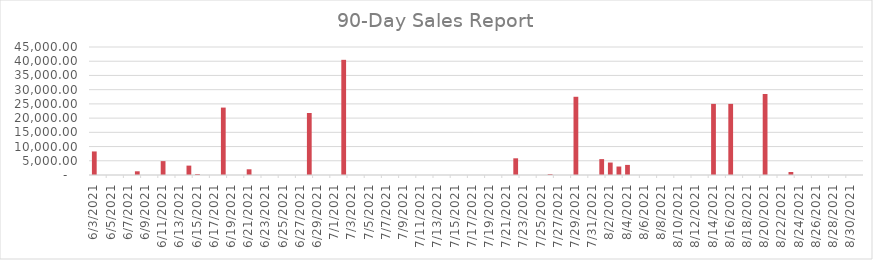
| Category | Sales |
|---|---|
| 8/31/21 | 0 |
| 8/30/21 | 0 |
| 8/29/21 | 0 |
| 8/28/21 | 0 |
| 8/27/21 | 0 |
| 8/26/21 | 0 |
| 8/25/21 | 0 |
| 8/24/21 | 0 |
| 8/23/21 | 1050 |
| 8/22/21 | 0 |
| 8/21/21 | 0 |
| 8/20/21 | 28480 |
| 8/19/21 | 0 |
| 8/18/21 | 0 |
| 8/17/21 | 0 |
| 8/16/21 | 25000 |
| 8/15/21 | 0 |
| 8/14/21 | 25000 |
| 8/13/21 | 0 |
| 8/12/21 | 0 |
| 8/11/21 | 0 |
| 8/10/21 | 0 |
| 8/9/21 | 0 |
| 8/8/21 | 0 |
| 8/7/21 | 0 |
| 8/6/21 | 0 |
| 8/5/21 | 0 |
| 8/4/21 | 3550 |
| 8/3/21 | 2980 |
| 8/2/21 | 4380 |
| 8/1/21 | 5580 |
| 7/31/21 | 0 |
| 7/30/21 | 0 |
| 7/29/21 | 27500 |
| 7/28/21 | 0 |
| 7/27/21 | 0 |
| 7/26/21 | 300 |
| 7/25/21 | 0 |
| 7/24/21 | 0 |
| 7/23/21 | 0 |
| 7/22/21 | 5870 |
| 7/21/21 | 0 |
| 7/20/21 | 0 |
| 7/19/21 | 0 |
| 7/18/21 | 0 |
| 7/17/21 | 0 |
| 7/16/21 | 0 |
| 7/15/21 | 0 |
| 7/14/21 | 0 |
| 7/13/21 | 0 |
| 7/12/21 | 0 |
| 7/11/21 | 0 |
| 7/10/21 | 0 |
| 7/9/21 | 0 |
| 7/8/21 | 0 |
| 7/7/21 | 0 |
| 7/6/21 | 0 |
| 7/5/21 | 0 |
| 7/4/21 | 0 |
| 7/3/21 | 0 |
| 7/2/21 | 40490 |
| 7/1/21 | 0 |
| 6/30/21 | 0 |
| 6/29/21 | 0 |
| 6/28/21 | 21800 |
| 6/27/21 | 0 |
| 6/26/21 | 0 |
| 6/25/21 | 0 |
| 6/24/21 | 0 |
| 6/23/21 | 0 |
| 6/22/21 | 0 |
| 6/21/21 | 2010 |
| 6/20/21 | 0 |
| 6/19/21 | 0 |
| 6/18/21 | 23700 |
| 6/17/21 | 0 |
| 6/16/21 | 0 |
| 6/15/21 | 350 |
| 6/14/21 | 3300 |
| 6/13/21 | 0 |
| 6/12/21 | 0 |
| 6/11/21 | 4880 |
| 6/10/21 | 0 |
| 6/9/21 | 0 |
| 6/8/21 | 1300 |
| 6/7/21 | 0 |
| 6/6/21 | 0 |
| 6/5/21 | 0 |
| 6/4/21 | 0 |
| 6/3/21 | 8280 |